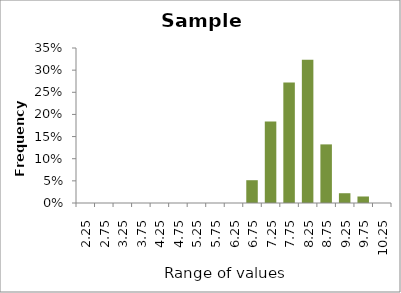
| Category | Sample 2 |
|---|---|
| 2.25 | 0 |
| 2.75 | 0 |
| 3.25 | 0 |
| 3.75 | 0 |
| 4.25 | 0 |
| 4.75 | 0 |
| 5.25 | 0 |
| 5.75 | 0 |
| 6.25 | 0 |
| 6.75 | 0.051 |
| 7.25 | 0.184 |
| 7.75 | 0.272 |
| 8.25 | 0.324 |
| 8.75 | 0.132 |
| 9.25 | 0.022 |
| 9.75 | 0.015 |
| 10.25 | 0 |